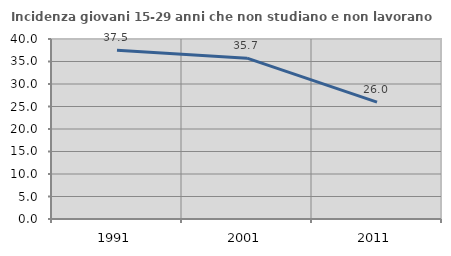
| Category | Incidenza giovani 15-29 anni che non studiano e non lavorano  |
|---|---|
| 1991.0 | 37.514 |
| 2001.0 | 35.739 |
| 2011.0 | 25.984 |